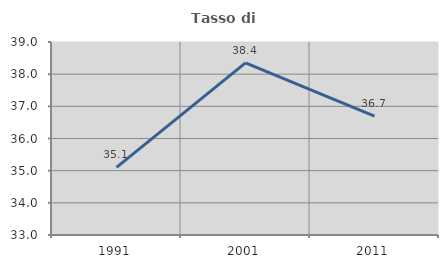
| Category | Tasso di occupazione   |
|---|---|
| 1991.0 | 35.104 |
| 2001.0 | 38.352 |
| 2011.0 | 36.694 |